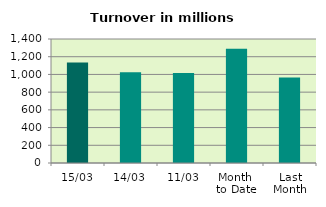
| Category | Series 0 |
|---|---|
| 15/03 | 1133.555 |
| 14/03 | 1023.585 |
| 11/03 | 1017.246 |
| Month 
to Date | 1288.789 |
| Last
Month | 966.674 |